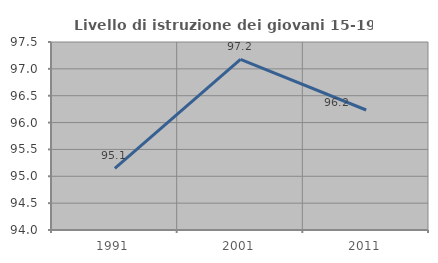
| Category | Livello di istruzione dei giovani 15-19 anni |
|---|---|
| 1991.0 | 95.146 |
| 2001.0 | 97.175 |
| 2011.0 | 96.234 |